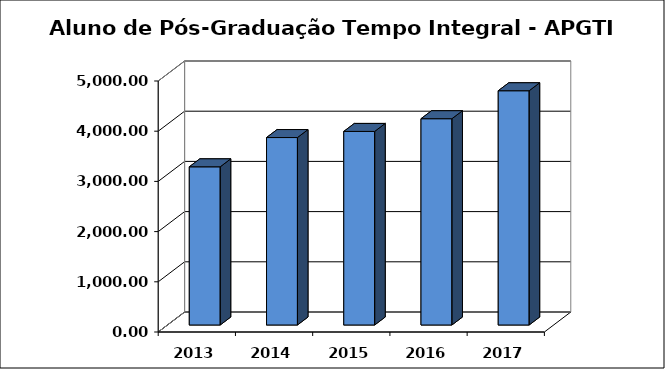
| Category | Series 0 |
|---|---|
| 2013.0 | 3151 |
| 2014.0 | 3734 |
| 2015.0 | 3855.833 |
| 2016.0 | 4108.98 |
| 2017.0 | 4666.167 |